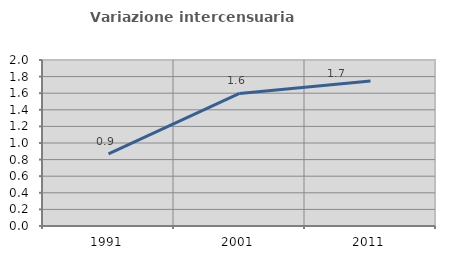
| Category | Variazione intercensuaria annua |
|---|---|
| 1991.0 | 0.868 |
| 2001.0 | 1.597 |
| 2011.0 | 1.748 |